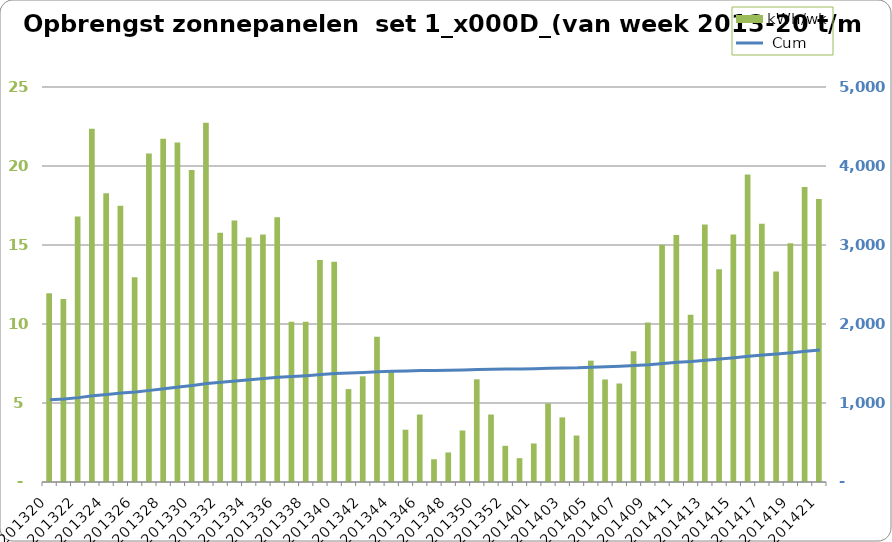
| Category |  kWh/wk |
|---|---|
| 201320.0 | 11.94 |
| 201321.0 | 11.59 |
| 201322.0 | 16.8 |
| 201323.0 | 22.36 |
| 201324.0 | 18.28 |
| 201325.0 | 17.48 |
| 201326.0 | 12.96 |
| 201327.0 | 20.79 |
| 201328.0 | 21.73 |
| 201329.0 | 21.48 |
| 201330.0 | 19.74 |
| 201331.0 | 22.74 |
| 201332.0 | 15.78 |
| 201333.0 | 16.55 |
| 201334.0 | 15.48 |
| 201335.0 | 15.66 |
| 201336.0 | 16.75 |
| 201337.0 | 10.14 |
| 201338.0 | 10.15 |
| 201339.0 | 14.05 |
| 201340.0 | 13.94 |
| 201341.0 | 5.88 |
| 201342.0 | 6.69 |
| 201343.0 | 9.2 |
| 201344.0 | 7.02 |
| 201345.0 | 3.31 |
| 201346.0 | 4.27 |
| 201347.0 | 1.44 |
| 201348.0 | 1.87 |
| 201349.0 | 3.26 |
| 201350.0 | 6.5 |
| 201351.0 | 4.27 |
| 201352.0 | 2.29 |
| 201353.0 | 1.51 |
| 201401.0 | 2.44 |
| 201402.0 | 4.97 |
| 201403.0 | 4.09 |
| 201404.0 | 2.94 |
| 201405.0 | 7.68 |
| 201406.0 | 6.49 |
| 201407.0 | 6.234 |
| 201408.0 | 8.27 |
| 201409.0 | 10.09 |
| 201410.0 | 15.01 |
| 201411.0 | 15.64 |
| 201412.0 | 10.59 |
| 201413.0 | 16.29 |
| 201414.0 | 13.46 |
| 201415.0 | 15.67 |
| 201416.0 | 19.46 |
| 201417.0 | 16.34 |
| 201418.0 | 13.32 |
| 201419.0 | 15.11 |
| 201420.0 | 18.67 |
| 201421.0 | 17.91 |